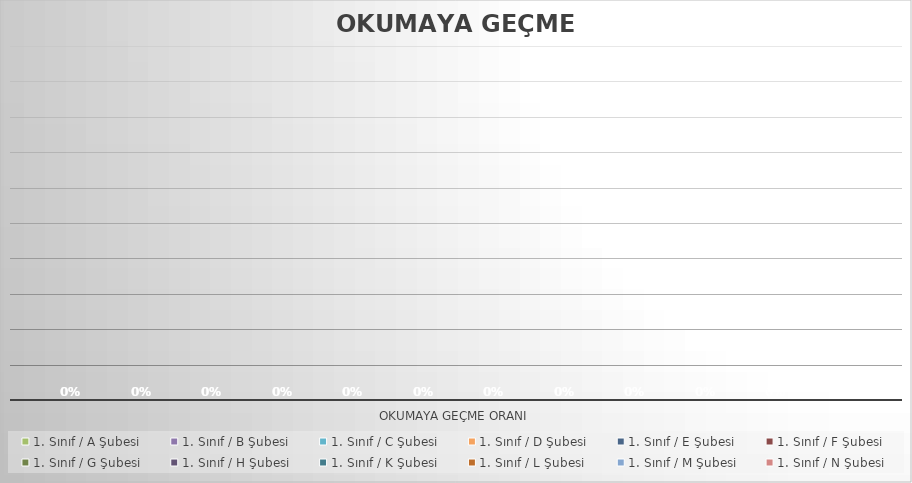
| Category | 1. Sınıf / A Şubesi | 1. Sınıf / B Şubesi | 1. Sınıf / C Şubesi | 1. Sınıf / D Şubesi | 1. Sınıf / E Şubesi | 1. Sınıf / F Şubesi | 1. Sınıf / G Şubesi | 1. Sınıf / H Şubesi | 1. Sınıf / K Şubesi | 1. Sınıf / L Şubesi | 1. Sınıf / M Şubesi | 1. Sınıf / N Şubesi |
|---|---|---|---|---|---|---|---|---|---|---|---|---|
| Okumaya Geçme Oranı | 0 | 0 | 0 | 0 | 0 | 0 | 0 | 0 | 0 | 0 | 0 | 0 |